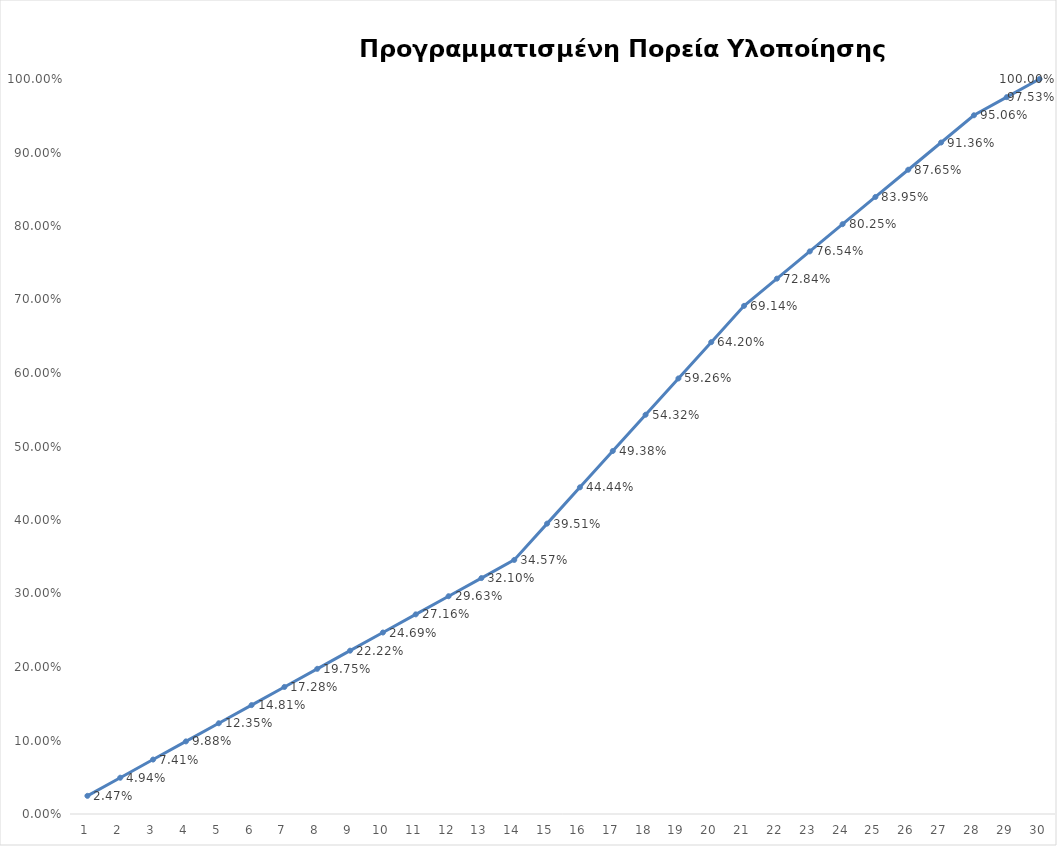
| Category | Series 0 |
|---|---|
| 0 | 0.025 |
| 1 | 0.049 |
| 2 | 0.074 |
| 3 | 0.099 |
| 4 | 0.123 |
| 5 | 0.148 |
| 6 | 0.173 |
| 7 | 0.198 |
| 8 | 0.222 |
| 9 | 0.247 |
| 10 | 0.272 |
| 11 | 0.296 |
| 12 | 0.321 |
| 13 | 0.346 |
| 14 | 0.395 |
| 15 | 0.444 |
| 16 | 0.494 |
| 17 | 0.543 |
| 18 | 0.593 |
| 19 | 0.642 |
| 20 | 0.691 |
| 21 | 0.728 |
| 22 | 0.765 |
| 23 | 0.802 |
| 24 | 0.84 |
| 25 | 0.877 |
| 26 | 0.914 |
| 27 | 0.951 |
| 28 | 0.975 |
| 29 | 1 |